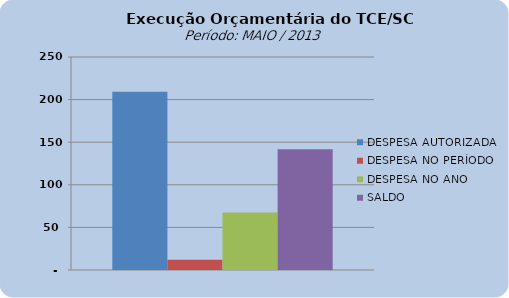
| Category | DESPESA AUTORIZADA | DESPESA NO PERÍODO | DESPESA NO ANO | SALDO |
|---|---|---|---|---|
| 0 | 209293269.61 | 12070214.85 | 67536610.58 | 141756659.03 |